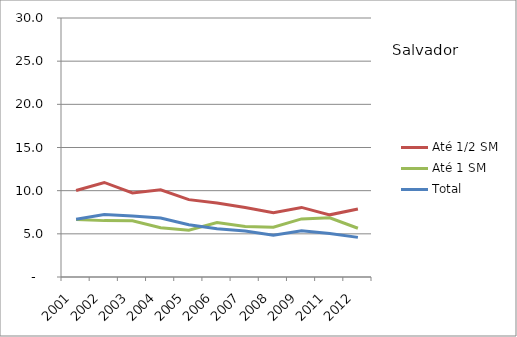
| Category | Até 1/2 SM | Até 1 SM | Total |
|---|---|---|---|
| 2001.0 | 10.02 | 6.67 | 6.7 |
| 2002.0 | 10.95 | 6.53 | 7.24 |
| 2003.0 | 9.74 | 6.52 | 7.07 |
| 2004.0 | 10.1 | 5.71 | 6.84 |
| 2005.0 | 8.96 | 5.43 | 6.06 |
| 2006.0 | 8.58 | 6.32 | 5.58 |
| 2007.0 | 8.06 | 5.84 | 5.34 |
| 2008.0 | 7.45 | 5.77 | 4.84 |
| 2009.0 | 8.06 | 6.73 | 5.36 |
| 2011.0 | 7.2 | 6.85 | 5.04 |
| 2012.0 | 7.87 | 5.65 | 4.59 |